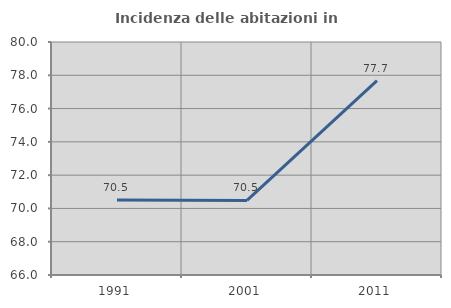
| Category | Incidenza delle abitazioni in proprietà  |
|---|---|
| 1991.0 | 70.501 |
| 2001.0 | 70.479 |
| 2011.0 | 77.681 |